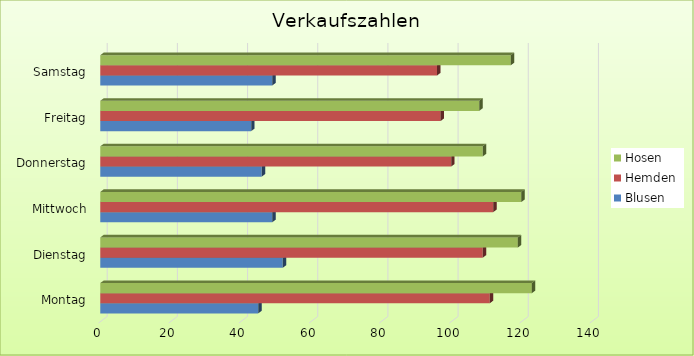
| Category | Blusen | Hemden | Hosen |
|---|---|---|---|
| Montag | 45 | 111 | 123 |
| Dienstag | 52 | 109 | 119 |
| Mittwoch | 49 | 112 | 120 |
| Donnerstag | 46 | 100 | 109 |
| Freitag | 43 | 97 | 108 |
| Samstag | 49 | 96 | 117 |